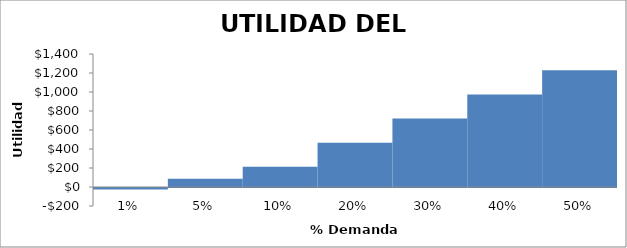
| Category | UTILIDAD |
|---|---|
| 0.01 | -15.868 |
| 0.05 | 85.662 |
| 0.1 | 212.574 |
| 0.2 | 466.399 |
| 0.3 | 720.223 |
| 0.4 | 974.047 |
| 0.5 | 1227.872 |